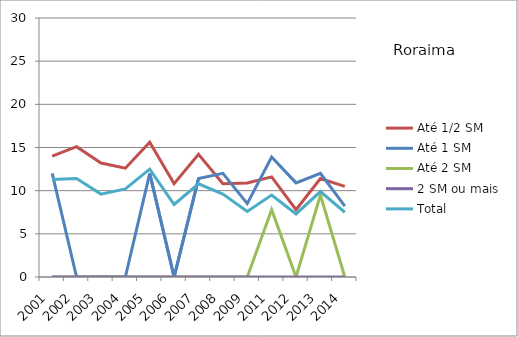
| Category | Até 1/2 SM | Até 1 SM | Até 2 SM | 2 SM ou mais | Total |
|---|---|---|---|---|---|
| 2001.0 | 14 | 12 | 0 | 0 | 11.3 |
| 2002.0 | 15.1 | 0 | 0 | 0 | 11.4 |
| 2003.0 | 13.2 | 0 | 0 | 0 | 9.6 |
| 2004.0 | 12.6 | 0 | 0 | 0 | 10.2 |
| 2005.0 | 15.6 | 12 | 0 | 0 | 12.5 |
| 2006.0 | 10.8 | 0 | 0 | 0 | 8.4 |
| 2007.0 | 14.2 | 11.4 | 0 | 0 | 10.8 |
| 2008.0 | 10.8 | 12 | 0 | 0 | 9.6 |
| 2009.0 | 10.9 | 8.5 | 0 | 0 | 7.6 |
| 2011.0 | 11.6 | 13.9 | 7.8 | 0 | 9.5 |
| 2012.0 | 7.8 | 10.9 | 0 | 0 | 7.3 |
| 2013.0 | 11.4 | 12 | 9.5 | 0 | 9.9 |
| 2014.0 | 10.5 | 8.2 | 0 | 0 | 7.5 |